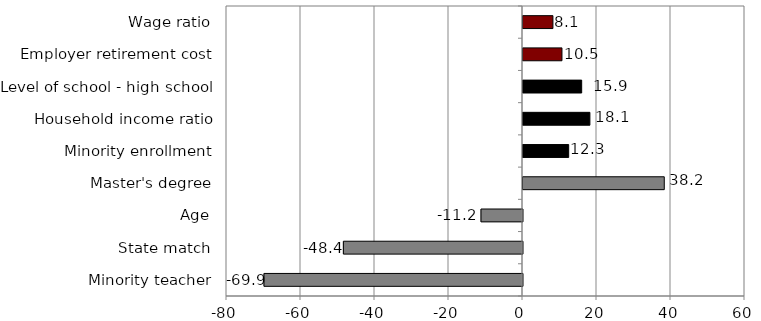
| Category | Series 0 |
|---|---|
| Minority teacher | -69.87 |
| State match | -48.41 |
| Age | -11.219 |
| Master's degree | 38.18 |
| Minority enrollment | 12.347 |
| Household income ratio | 18.079 |
| Level of school - high school | 15.86 |
| Employer retirement cost | 10.529 |
| Wage ratio | 8.088 |